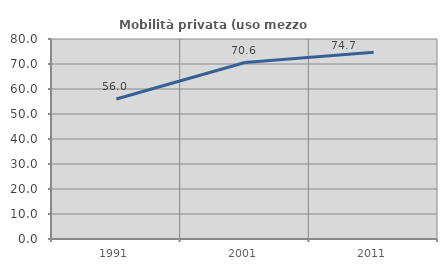
| Category | Mobilità privata (uso mezzo privato) |
|---|---|
| 1991.0 | 56.003 |
| 2001.0 | 70.583 |
| 2011.0 | 74.67 |